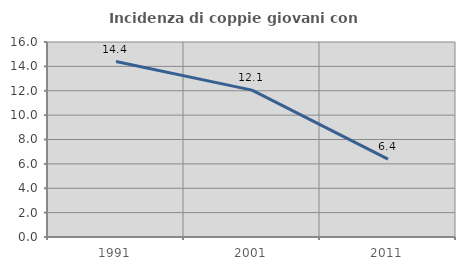
| Category | Incidenza di coppie giovani con figli |
|---|---|
| 1991.0 | 14.4 |
| 2001.0 | 12.052 |
| 2011.0 | 6.395 |